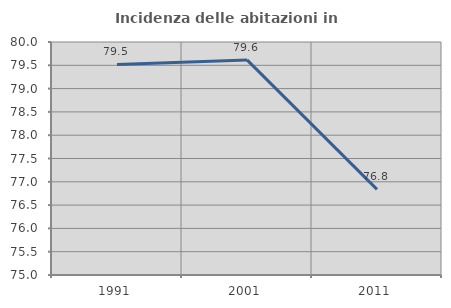
| Category | Incidenza delle abitazioni in proprietà  |
|---|---|
| 1991.0 | 79.518 |
| 2001.0 | 79.615 |
| 2011.0 | 76.836 |